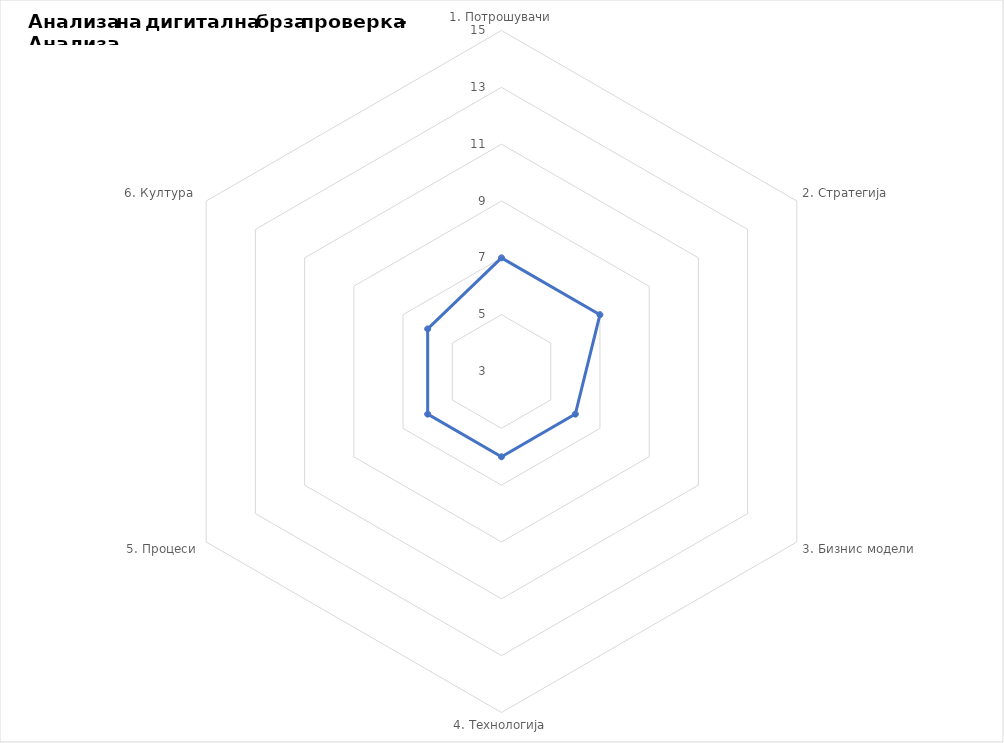
| Category | Series 0 |
|---|---|
| 1. Потрошувачи | 7 |
| 2. Стратегија | 7 |
| 3. Бизнис модели | 6 |
| 4. Технологија | 6 |
| 5. Процеси | 6 |
| 6. Култура  | 6 |